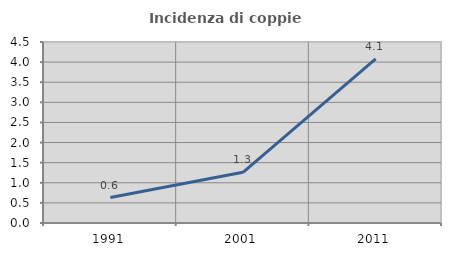
| Category | Incidenza di coppie miste |
|---|---|
| 1991.0 | 0.632 |
| 2001.0 | 1.26 |
| 2011.0 | 4.082 |